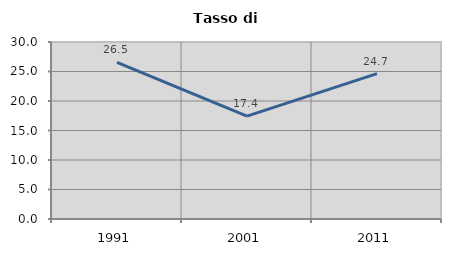
| Category | Tasso di disoccupazione   |
|---|---|
| 1991.0 | 26.535 |
| 2001.0 | 17.439 |
| 2011.0 | 24.652 |